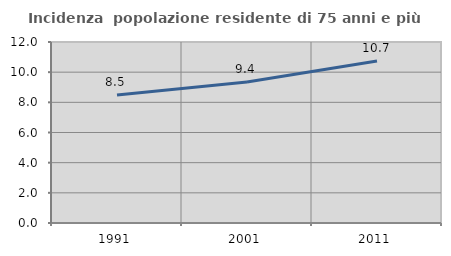
| Category | Incidenza  popolazione residente di 75 anni e più |
|---|---|
| 1991.0 | 8.486 |
| 2001.0 | 9.353 |
| 2011.0 | 10.737 |